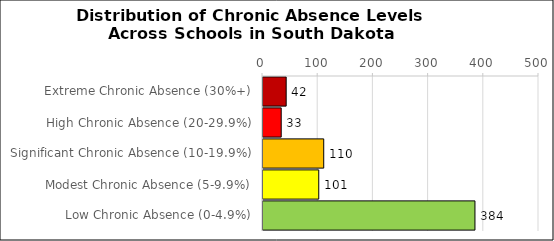
| Category | Number of Schools |
|---|---|
| Extreme Chronic Absence (30%+) | 42 |
| High Chronic Absence (20-29.9%) | 33 |
| Significant Chronic Absence (10-19.9%) | 110 |
| Modest Chronic Absence (5-9.9%) | 101 |
| Low Chronic Absence (0-4.9%) | 384 |